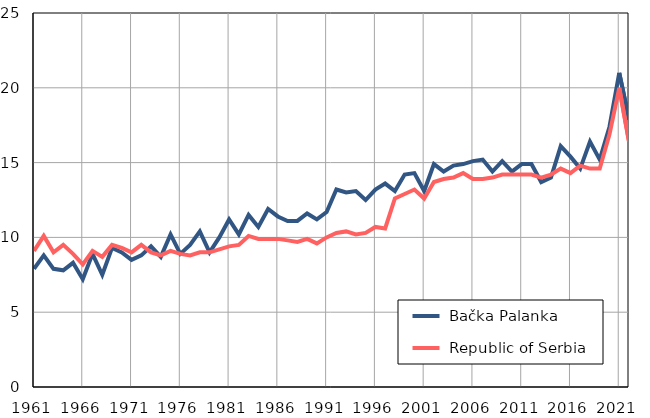
| Category |  Bačka Palanka |  Republic of Serbia |
|---|---|---|
| 1961.0 | 7.9 | 9.1 |
| 1962.0 | 8.8 | 10.1 |
| 1963.0 | 7.9 | 9 |
| 1964.0 | 7.8 | 9.5 |
| 1965.0 | 8.3 | 8.9 |
| 1966.0 | 7.2 | 8.2 |
| 1967.0 | 8.9 | 9.1 |
| 1968.0 | 7.5 | 8.7 |
| 1969.0 | 9.3 | 9.5 |
| 1970.0 | 9 | 9.3 |
| 1971.0 | 8.5 | 9 |
| 1972.0 | 8.8 | 9.5 |
| 1973.0 | 9.4 | 9 |
| 1974.0 | 8.7 | 8.8 |
| 1975.0 | 10.2 | 9.1 |
| 1976.0 | 8.9 | 8.9 |
| 1977.0 | 9.5 | 8.8 |
| 1978.0 | 10.4 | 9 |
| 1979.0 | 9 | 9 |
| 1980.0 | 10 | 9.2 |
| 1981.0 | 11.2 | 9.4 |
| 1982.0 | 10.2 | 9.5 |
| 1983.0 | 11.5 | 10.1 |
| 1984.0 | 10.7 | 9.9 |
| 1985.0 | 11.9 | 9.9 |
| 1986.0 | 11.4 | 9.9 |
| 1987.0 | 11.1 | 9.8 |
| 1988.0 | 11.1 | 9.7 |
| 1989.0 | 11.6 | 9.9 |
| 1990.0 | 11.2 | 9.6 |
| 1991.0 | 11.7 | 10 |
| 1992.0 | 13.2 | 10.3 |
| 1993.0 | 13 | 10.4 |
| 1994.0 | 13.1 | 10.2 |
| 1995.0 | 12.5 | 10.3 |
| 1996.0 | 13.2 | 10.7 |
| 1997.0 | 13.6 | 10.6 |
| 1998.0 | 13.1 | 12.6 |
| 1999.0 | 14.2 | 12.9 |
| 2000.0 | 14.3 | 13.2 |
| 2001.0 | 13.1 | 12.6 |
| 2002.0 | 14.9 | 13.7 |
| 2003.0 | 14.4 | 13.9 |
| 2004.0 | 14.8 | 14 |
| 2005.0 | 14.9 | 14.3 |
| 2006.0 | 15.1 | 13.9 |
| 2007.0 | 15.2 | 13.9 |
| 2008.0 | 14.4 | 14 |
| 2009.0 | 15.1 | 14.2 |
| 2010.0 | 14.4 | 14.2 |
| 2011.0 | 14.9 | 14.2 |
| 2012.0 | 14.9 | 14.2 |
| 2013.0 | 13.7 | 14 |
| 2014.0 | 14 | 14.2 |
| 2015.0 | 16.1 | 14.6 |
| 2016.0 | 15.4 | 14.3 |
| 2017.0 | 14.6 | 14.8 |
| 2018.0 | 16.4 | 14.6 |
| 2019.0 | 15.2 | 14.6 |
| 2020.0 | 17.4 | 16.9 |
| 2021.0 | 21 | 20 |
| 2022.0 | 17.9 | 16.4 |